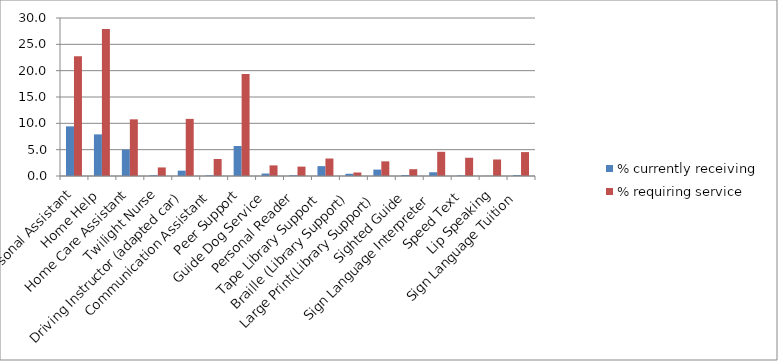
| Category | % currently receiving | % requiring service |
|---|---|---|
| Personal Assistant | 9.424 | 22.735 |
| Home Help | 7.902 | 27.896 |
| Home Care Assistant | 5.017 | 10.758 |
| Twilight Nurse | 0.145 | 1.624 |
| Driving Instructor (adapted car) | 1.015 | 10.845 |
| Communication Assistant | 0.116 | 3.233 |
| Peer Support | 5.698 | 19.371 |
| Guide Dog Service | 0.464 | 2.015 |
| Personal Reader | 0.145 | 1.783 |
| Tape Library Support | 1.87 | 3.32 |
| Braille (Library Support) | 0.42 | 0.667 |
| Large Print(Library Support) | 1.218 | 2.784 |
| Sighted Guide | 0.188 | 1.29 |
| Sign Language Interpreter | 0.71 | 4.596 |
| Speed Text | 0.101 | 3.465 |
| Lip Speaking | 0.029 | 3.132 |
| Sign Language Tuition | 0.174 | 4.538 |